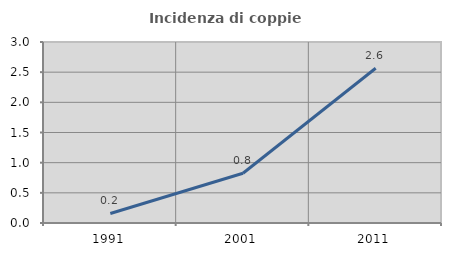
| Category | Incidenza di coppie miste |
|---|---|
| 1991.0 | 0.158 |
| 2001.0 | 0.825 |
| 2011.0 | 2.564 |